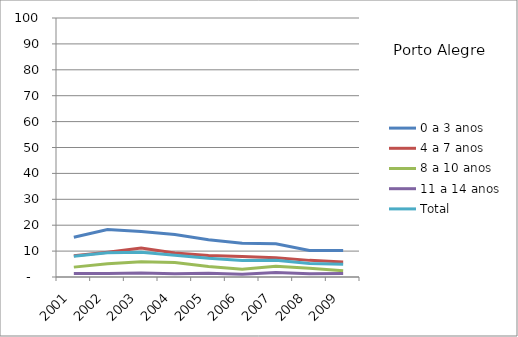
| Category | 0 a 3 anos | 4 a 7 anos | 8 a 10 anos | 11 a 14 anos | Total |
|---|---|---|---|---|---|
| 2001.0 | 15.36 | 8.18 | 3.81 | 1.31 | 8.04 |
| 2002.0 | 18.3 | 9.58 | 5.1 | 1.35 | 9.35 |
| 2003.0 | 17.55 | 11.16 | 5.84 | 1.54 | 9.53 |
| 2004.0 | 16.39 | 9.27 | 5.63 | 1.24 | 8.37 |
| 2005.0 | 14.41 | 8.31 | 4.02 | 1.44 | 7.2 |
| 2006.0 | 13.03 | 7.95 | 2.97 | 1.03 | 6.39 |
| 2007.0 | 12.83 | 7.41 | 4.16 | 1.78 | 6.5 |
| 2008.0 | 10.22 | 6.42 | 3.42 | 1.23 | 5.25 |
| 2009.0 | 10.2 | 5.78 | 2.42 | 1.38 | 4.88 |